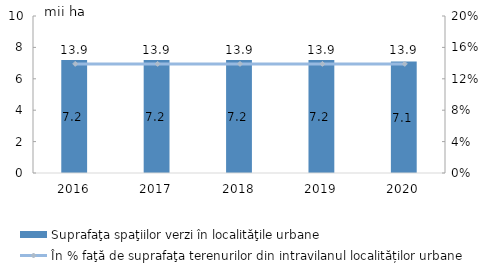
| Category | Suprafaţa spaţiilor verzi în localităţile urbane |
|---|---|
| 2016.0 | 7.2 |
| 2017.0 | 7.2 |
| 2018.0 | 7.2 |
| 2019.0 | 7.2 |
| 2020.0 | 7.1 |